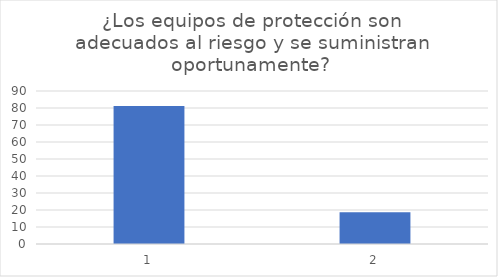
| Category | ¿Los equipos de protección son adecuados al riesgo y se suministran
oportunamente? |
|---|---|
| 0 | 81.25 |
| 1 | 18.75 |